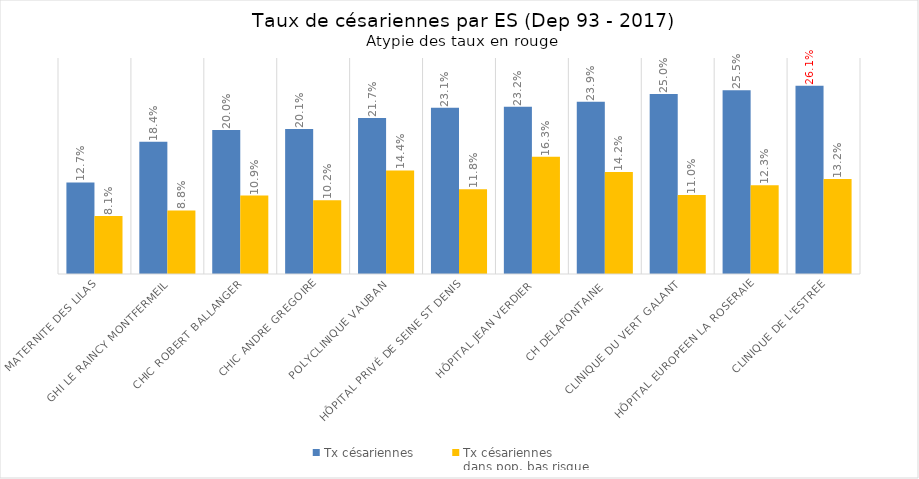
| Category | Tx césariennes | Tx césariennes 
dans pop. bas risque |
|---|---|---|
| MATERNITE DES LILAS | 0.127 | 0.081 |
| GHI LE RAINCY MONTFERMEIL | 0.184 | 0.088 |
| CHIC ROBERT BALLANGER | 0.2 | 0.109 |
| CHIC ANDRE GREGOIRE | 0.201 | 0.102 |
| POLYCLINIQUE VAUBAN | 0.217 | 0.144 |
| HÔPITAL PRIVÉ DE SEINE ST DENIS | 0.231 | 0.118 |
| HÔPITAL JEAN VERDIER | 0.232 | 0.163 |
| CH DELAFONTAINE | 0.239 | 0.142 |
| CLINIQUE DU VERT GALANT | 0.25 | 0.11 |
| HÔPITAL EUROPEEN LA ROSERAIE | 0.255 | 0.123 |
| CLINIQUE DE L'ESTREE | 0.261 | 0.132 |